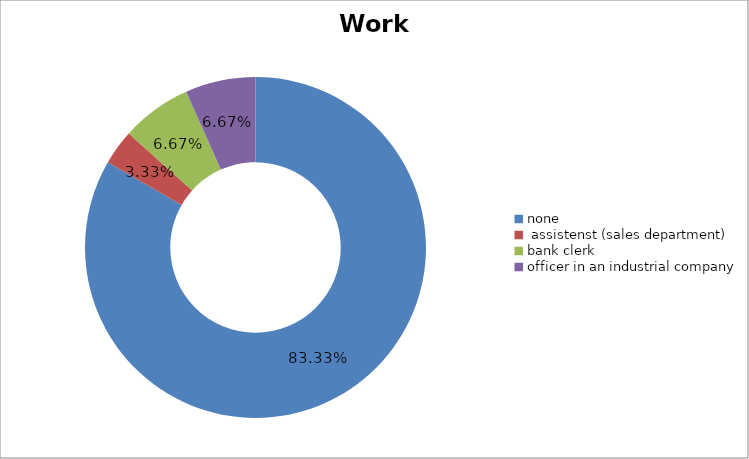
| Category | Work Experience |
|---|---|
| none | 0.833 |
|  assistenst (sales department) | 0.033 |
| bank clerk | 0.067 |
| officer in an industrial company | 0.067 |